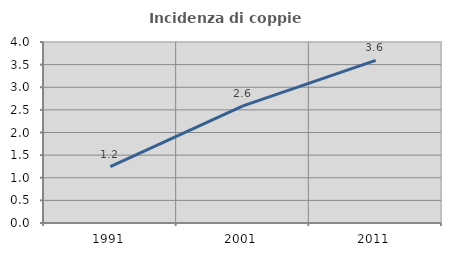
| Category | Incidenza di coppie miste |
|---|---|
| 1991.0 | 1.246 |
| 2001.0 | 2.589 |
| 2011.0 | 3.595 |